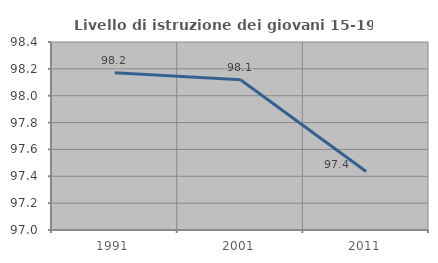
| Category | Livello di istruzione dei giovani 15-19 anni |
|---|---|
| 1991.0 | 98.171 |
| 2001.0 | 98.119 |
| 2011.0 | 97.436 |